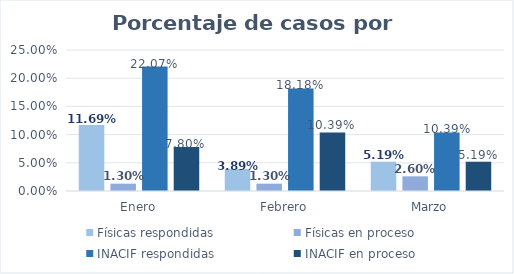
| Category | Físicas respondidas | Físicas en proceso | INACIF respondidas | INACIF en proceso |
|---|---|---|---|---|
| Enero | 0.117 | 0.013 | 0.221 | 0.078 |
| Febrero | 0.039 | 0.013 | 0.182 | 0.104 |
| Marzo | 0.052 | 0.026 | 0.104 | 0.052 |